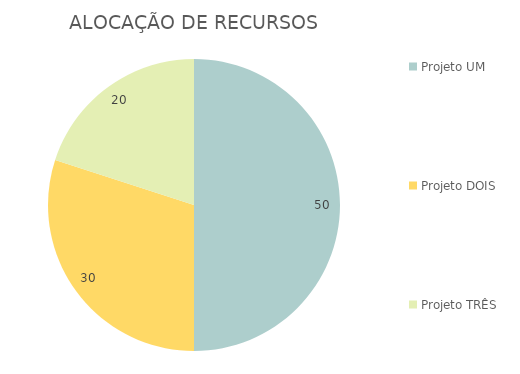
| Category | Series 0 |
|---|---|
| Projeto UM | 50 |
| Projeto DOIS | 30 |
| Projeto TRÊS | 20 |